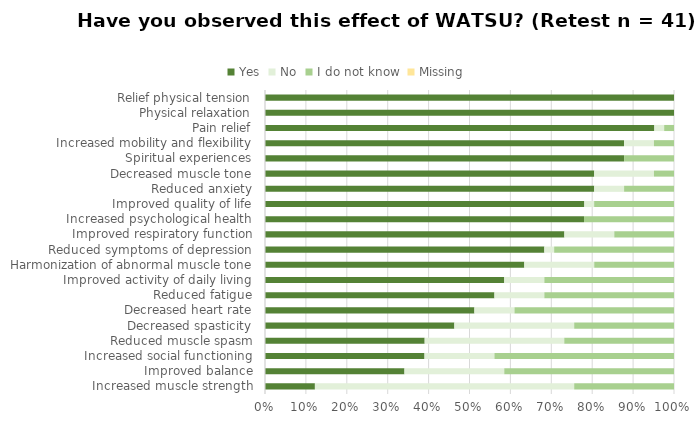
| Category | Yes | No | I do not know | Missing |
|---|---|---|---|---|
| Relief physical tension | 100 | 0 | 0 | 0 |
| Physical relaxation | 100 | 0 | 0 | 0 |
| Pain relief | 95.1 | 2.4 | 2.4 | 0 |
| Increased mobility and flexibility | 87.8 | 7.3 | 4.9 | 0 |
| Spiritual experiences | 87.8 | 0 | 12.2 | 0 |
| Decreased muscle tone | 80.5 | 14.6 | 4.9 | 0 |
| Reduced anxiety | 80.5 | 7.3 | 12.2 | 0 |
| Improved quality of life | 78 | 2.4 | 19.5 | 0 |
| Increased psychological health | 78 | 0 | 22 | 0 |
| Improved respiratory function | 73.2 | 12.2 | 14.6 | 0 |
| Reduced symptoms of depression | 68.3 | 2.4 | 29.3 | 0 |
| Harmonization of abnormal muscle tone | 63.4 | 17.1 | 19.5 | 0 |
| Improved activity of daily living | 58.5 | 9.8 | 31.7 | 0 |
| Reduced fatigue | 56.1 | 12.2 | 31.7 | 0 |
| Decreased heart rate | 51.2 | 9.8 | 39 | 0 |
| Decreased spasticity | 46.3 | 29.3 | 24.4 | 0 |
| Reduced muscle spasm | 39 | 34.1 | 26.8 | 0 |
| Increased social functioning | 39 | 17.1 | 43.9 | 0 |
| Improved balance | 34.1 | 24.4 | 41.5 | 0 |
| Increased muscle strength | 12.2 | 63.4 | 24.4 | 0 |